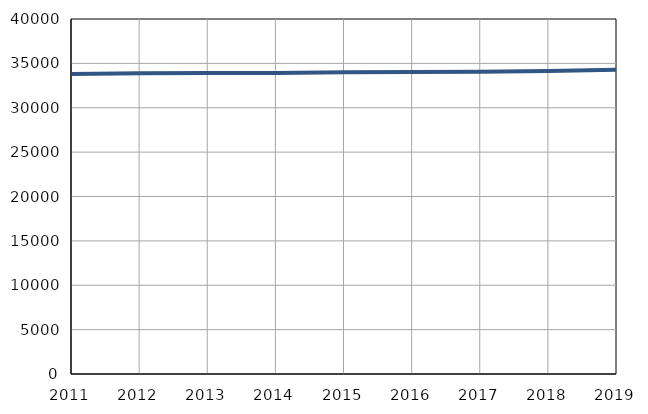
| Category | Population
size |
|---|---|
| 2011.0 | 33802 |
| 2012.0 | 33886 |
| 2013.0 | 33916 |
| 2014.0 | 33920 |
| 2015.0 | 33988 |
| 2016.0 | 34041 |
| 2017.0 | 34055 |
| 2018.0 | 34150 |
| 2019.0 | 34281 |